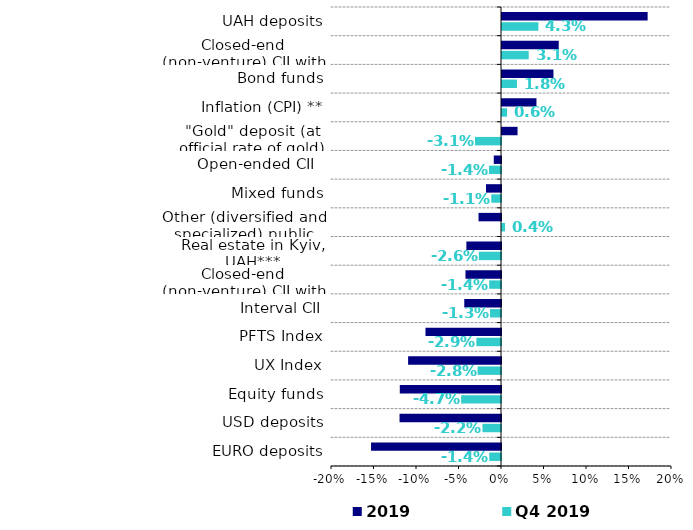
| Category | Q4 2019 | 2019 |
|---|---|---|
| EURO deposits | -0.014 | -0.153 |
| USD deposits | -0.022 | -0.119 |
| Equity funds | -0.047 | -0.119 |
| UX Index | -0.028 | -0.109 |
| PFTS Index | -0.029 | -0.089 |
| Interval CII | -0.013 | -0.043 |
| Closed-end (non-venture) CII with public issue | -0.014 | -0.042 |
| Real estate in Kyiv, UAH*** | -0.026 | -0.041 |
| Other (diversified and specialized) public funds    | 0.004 | -0.026 |
| Mixed funds | -0.011 | -0.018 |
| Open-ended CII   | -0.014 | -0.009 |
| "Gold" deposit (at official rate of gold) | -0.031 | 0.018 |
| Inflation (CPI) ** | 0.006 | 0.041 |
| Bond funds | 0.018 | 0.061 |
| Closed-end (non-venture) CII with private issue | 0.031 | 0.067 |
| UAH deposits | 0.043 | 0.171 |